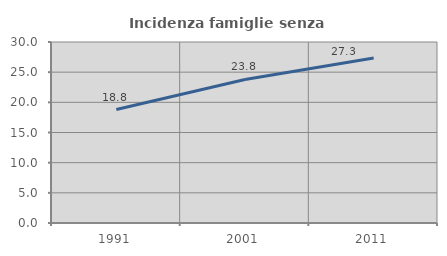
| Category | Incidenza famiglie senza nuclei |
|---|---|
| 1991.0 | 18.811 |
| 2001.0 | 23.787 |
| 2011.0 | 27.343 |